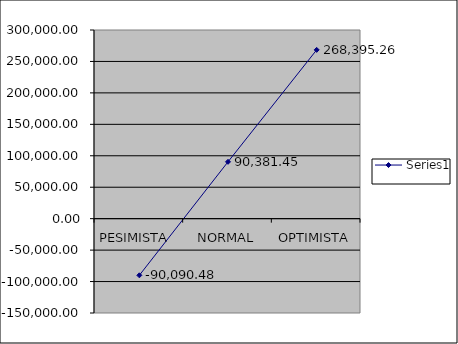
| Category | Series 0 |
|---|---|
| PESIMISTA  | -90090.48 |
| NORMAL | 90381.45 |
| OPTIMISTA | 268395.26 |